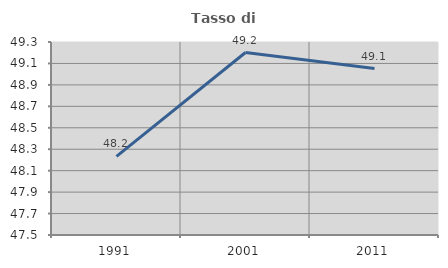
| Category | Tasso di occupazione   |
|---|---|
| 1991.0 | 48.233 |
| 2001.0 | 49.202 |
| 2011.0 | 49.053 |